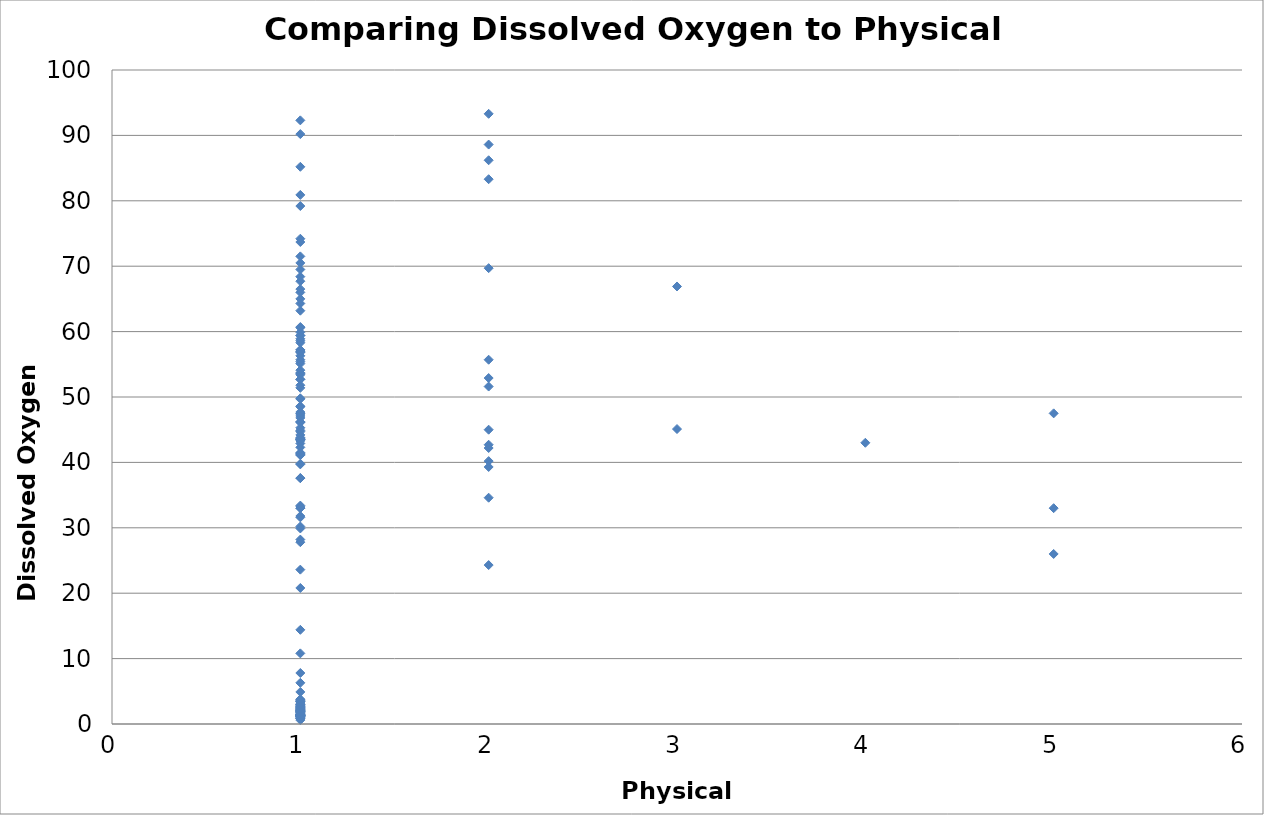
| Category | Dissolved Oxygen % |
|---|---|
| 2.0 | 52.9 |
| 2.0 | 51.6 |
| 2.0 | 55.7 |
| 1.0 | 56.3 |
| 5.0 | 47.5 |
| 1.0 | 71.5 |
| 1.0 | 70.5 |
| 1.0 | 67.7 |
| 1.0 | 57.2 |
| 1.0 | 10.8 |
| 1.0 | 64.3 |
| 1.0 | 63.2 |
| 1.0 | 60.7 |
| 1.0 | 58.9 |
| 1.0 | 28.2 |
| 1.0 | 7.8 |
| 1.0 | 3.2 |
| 1.0 | 2.8 |
| 1.0 | 60.6 |
| 1.0 | 59.4 |
| 1.0 | 58.6 |
| 1.0 | 58.3 |
| 1.0 | 47.1 |
| 1.0 | 46.2 |
| 1.0 | 46.8 |
| 1.0 | 41.4 |
| 1.0 | 14.4 |
| 1.0 | 1.5 |
| 1.0 | 1.7 |
| 1.0 | 2 |
| 1.0 | 44.9 |
| 1.0 | 43.6 |
| 1.0 | 37.6 |
| 1.0 | 1.3 |
| 1.0 | 0.9 |
| 1.0 | 0.6 |
| 1.0 | 0.8 |
| 1.0 | 1.1 |
| 1.0 | 1.3 |
| 1.0 | 2.3 |
| 1.0 | 39.8 |
| 1.0 | 48.6 |
| 1.0 | 49.7 |
| 1.0 | 48.5 |
| 1.0 | 42.3 |
| 1.0 | 52.7 |
| 1.0 | 55.1 |
| 1.0 | 53.7 |
| 1.0 | 47.7 |
| 1.0 | 23.6 |
| 1.0 | 47.5 |
| 1.0 | 46.2 |
| 1.0 | 44.7 |
| 1.0 | 39.7 |
| 1.0 | 31.8 |
| 1.0 | 1.5 |
| 1.0 | 1.9 |
| 1.0 | 2.7 |
| 1.0 | 59.9 |
| 1.0 | 59.4 |
| 1.0 | 57.2 |
| 1.0 | 53.6 |
| 1.0 | 33.4 |
| 1.0 | 6.3 |
| 1.0 | 1.6 |
| 1.0 | 1.8 |
| 1.0 | 2.2 |
| 1.0 | 2.9 |
| 1.0 | 3.7 |
| 1.0 | 2.4 |
| 1.0 | 33.2 |
| 1.0 | 31.6 |
| 1.0 | 33 |
| 1.0 | 29.9 |
| 1.0 | 20.8 |
| 1.0 | 3.4 |
| 1.0 | 57 |
| 1.0 | 56.9 |
| 1.0 | 53.4 |
| 1.0 | 51.4 |
| 1.0 | 33 |
| 1.0 | 2.1 |
| 1.0 | 2.2 |
| 1.0 | 3 |
| 1.0 | 51.8 |
| 1.0 | 49.8 |
| 1.0 | 47.4 |
| 1.0 | 45.3 |
| 1.0 | 27.8 |
| 1.0 | 1.5 |
| 1.0 | 1.9 |
| 1.0 | 2.1 |
| 1.0 | 2.7 |
| 1.0 | 4.9 |
| 2.0 | 42.2 |
| 1.0 | 44.2 |
| 2.0 | 39.3 |
| 1.0 | 43.5 |
| 2.0 | 45 |
| 1.0 | 43.8 |
| 1.0 | 43.5 |
| 1.0 | 43.7 |
| 1.0 | 42.9 |
| 1.0 | 41.3 |
| 1.0 | 30.2 |
| 1.0 | 1.3 |
| 1.0 | 1.1 |
| 1.0 | 1.5 |
| 1.0 | 1.9 |
| 1.0 | 2.4 |
| 1.0 | 66.5 |
| 2.0 | 69.7 |
| 1.0 | 80.9 |
| 1.0 | 74.2 |
| 1.0 | 69.5 |
| 1.0 | 46.1 |
| 1.0 | 3.8 |
| 3.0 | 66.9 |
| 2.0 | 93.3 |
| 2.0 | 88.6 |
| 1.0 | 85.2 |
| 1.0 | 73.7 |
| 1.0 | 52.7 |
| 2.0 | 83.3 |
| 1.0 | 79.2 |
| 2.0 | 86.2 |
| 1.0 | 92.3 |
| 1.0 | 90.2 |
| 1.0 | 55.7 |
| 1.0 | 56.8 |
| 1.0 | 54.1 |
| 1.0 | 41.2 |
| 1.0 | 3 |
| 1.0 | 1.3 |
| 1.0 | 1.5 |
| 1.0 | 1.8 |
| 1.0 | 43.5 |
| 1.0 | 43.3 |
| 1.0 | 41.5 |
| 1.0 | 37.6 |
| 1.0 | 3.6 |
| 1.0 | 0.9 |
| 1.0 | 1 |
| 1.0 | 1.1 |
| 1.0 | 1.2 |
| 1.0 | 1.4 |
| 1.0 | 2 |
| 1.0 | 3.4 |
| 2.0 | 40.2 |
| 1.0 | 68.4 |
| 1.0 | 65 |
| 1.0 | 66 |
| 1.0 | 55.4 |
| 1.0 | 2.5 |
| 1.0 | 1.5 |
| 1.0 | 0.9 |
| 1.0 | 1.3 |
| 1.0 | 1.1 |
| 1.0 | 1.1 |
| 1.0 | 1.3 |
| 1.0 | 1.2 |
| 1.0 | 2.1 |
| 1.0 | 2.5 |
| 1.0 | 3.4 |
| 1.0 | 41.1 |
| 5.0 | 26 |
| 3.0 | 45.1 |
| 5.0 | 33 |
| 2.0 | 24.3 |
| 2.0 | 34.6 |
| 2.0 | 42.7 |
| 4.0 | 43 |